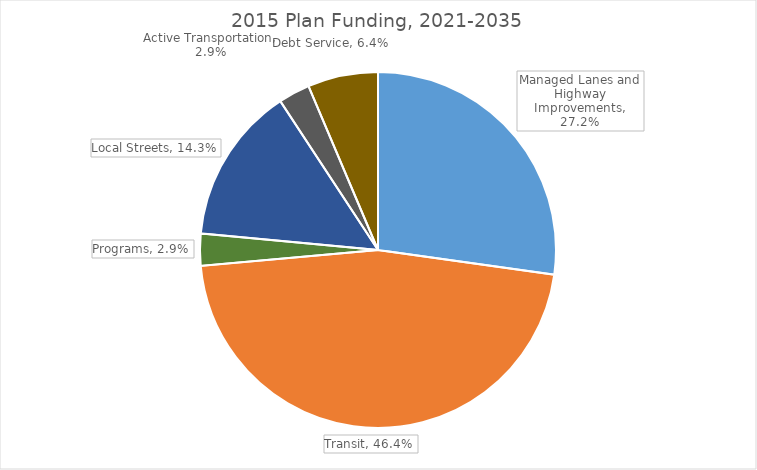
| Category | Series 0 |
|---|---|
| Managed Lanes and Highway Improvements | 0.272 |
| Transit | 0.464 |
| Programs | 0.029 |
| Local Streets | 0.143 |
| Active Transportation | 0.029 |
| Debt Service | 0.064 |